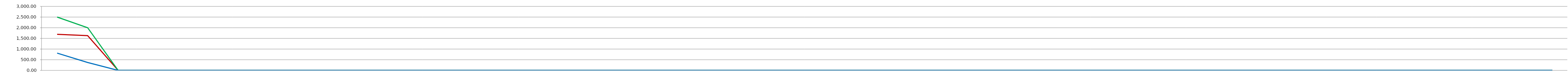
| Category | Spending | Revenue | Savings |
|---|---|---|---|
| 0 | 1690 | 2500 | 810 |
| 1 | 1630 | 2000 | 370 |
| 2 | 0 | 0 | 0 |
| 3 | 0 | 0 | 0 |
| 4 | 0 | 0 | 0 |
| 5 | 0 | 0 | 0 |
| 6 | 0 | 0 | 0 |
| 7 | 0 | 0 | 0 |
| 8 | 0 | 0 | 0 |
| 9 | 0 | 0 | 0 |
| 10 | 0 | 0 | 0 |
| 11 | 0 | 0 | 0 |
| 12 | 0 | 0 | 0 |
| 13 | 0 | 0 | 0 |
| 14 | 0 | 0 | 0 |
| 15 | 0 | 0 | 0 |
| 16 | 0 | 0 | 0 |
| 17 | 0 | 0 | 0 |
| 18 | 0 | 0 | 0 |
| 19 | 0 | 0 | 0 |
| 20 | 0 | 0 | 0 |
| 21 | 0 | 0 | 0 |
| 22 | 0 | 0 | 0 |
| 23 | 0 | 0 | 0 |
| 24 | 0 | 0 | 0 |
| 25 | 0 | 0 | 0 |
| 26 | 0 | 0 | 0 |
| 27 | 0 | 0 | 0 |
| 28 | 0 | 0 | 0 |
| 29 | 0 | 0 | 0 |
| 30 | 0 | 0 | 0 |
| 31 | 0 | 0 | 0 |
| 32 | 0 | 0 | 0 |
| 33 | 0 | 0 | 0 |
| 34 | 0 | 0 | 0 |
| 35 | 0 | 0 | 0 |
| 36 | 0 | 0 | 0 |
| 37 | 0 | 0 | 0 |
| 38 | 0 | 0 | 0 |
| 39 | 0 | 0 | 0 |
| 40 | 0 | 0 | 0 |
| 41 | 0 | 0 | 0 |
| 42 | 0 | 0 | 0 |
| 43 | 0 | 0 | 0 |
| 44 | 0 | 0 | 0 |
| 45 | 0 | 0 | 0 |
| 46 | 0 | 0 | 0 |
| 47 | 0 | 0 | 0 |
| 48 | 0 | 0 | 0 |
| 49 | 0 | 0 | 0 |